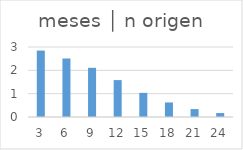
| Category | meses │ n origen |
|---|---|
| 3.0 | 2.847 |
| 6.0 | 2.507 |
| 9.0 | 2.108 |
| 12.0 | 1.582 |
| 15.0 | 1.035 |
| 18.0 | 0.624 |
| 21.0 | 0.339 |
| 24.0 | 0.17 |